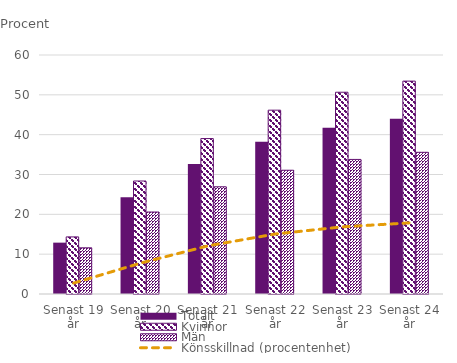
| Category | Totalt | Kvinnor | Män |
|---|---|---|---|
| Senast 19 år | 12.892 | 14.337 | 11.598 |
| Senast 20 år | 24.26 | 28.365 | 20.58 |
| Senast 21 år | 32.635 | 39.019 | 26.913 |
| Senast 22 år | 38.197 | 46.148 | 31.07 |
| Senast 23 år | 41.756 | 50.651 | 33.783 |
| Senast 24 år | 44.019 | 53.443 | 35.573 |